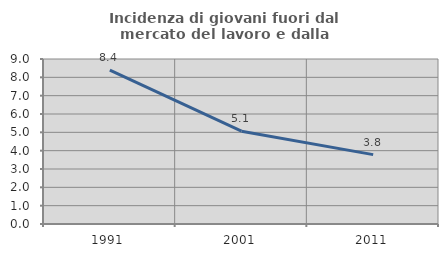
| Category | Incidenza di giovani fuori dal mercato del lavoro e dalla formazione  |
|---|---|
| 1991.0 | 8.392 |
| 2001.0 | 5.063 |
| 2011.0 | 3.784 |